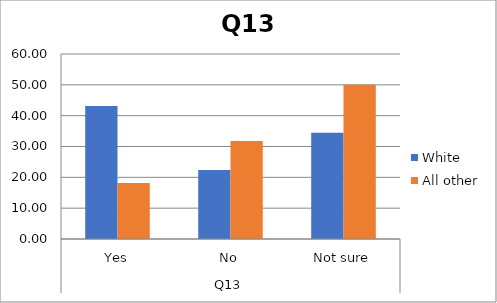
| Category | White | All other |
|---|---|---|
| 0 | 43.103 | 18.182 |
| 1 | 22.414 | 31.818 |
| 2 | 34.483 | 50 |